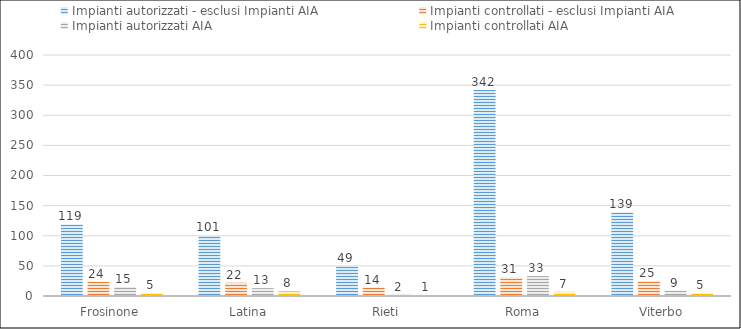
| Category | Impianti autorizzati - esclusi Impianti AIA | Impianti controllati - esclusi Impianti AIA | Impianti autorizzati AIA | Impianti controllati AIA |
|---|---|---|---|---|
| Frosinone | 119 | 24 | 15 | 5 |
| Latina | 101 | 22 | 13 | 8 |
| Rieti | 49 | 14 | 2 | 1 |
| Roma | 342 | 31 | 33 | 7 |
| Viterbo | 139 | 25 | 9 | 5 |